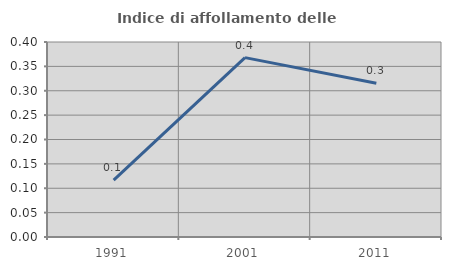
| Category | Indice di affollamento delle abitazioni  |
|---|---|
| 1991.0 | 0.117 |
| 2001.0 | 0.368 |
| 2011.0 | 0.315 |